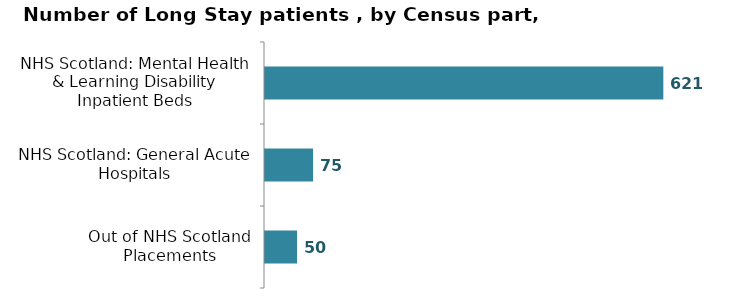
| Category | Series 0 |
|---|---|
| NHS Scotland: Mental Health & Learning Disability Inpatient Beds | 621 |
| NHS Scotland: General Acute Hospitals | 75 |
| Out of NHS Scotland Placements | 50 |